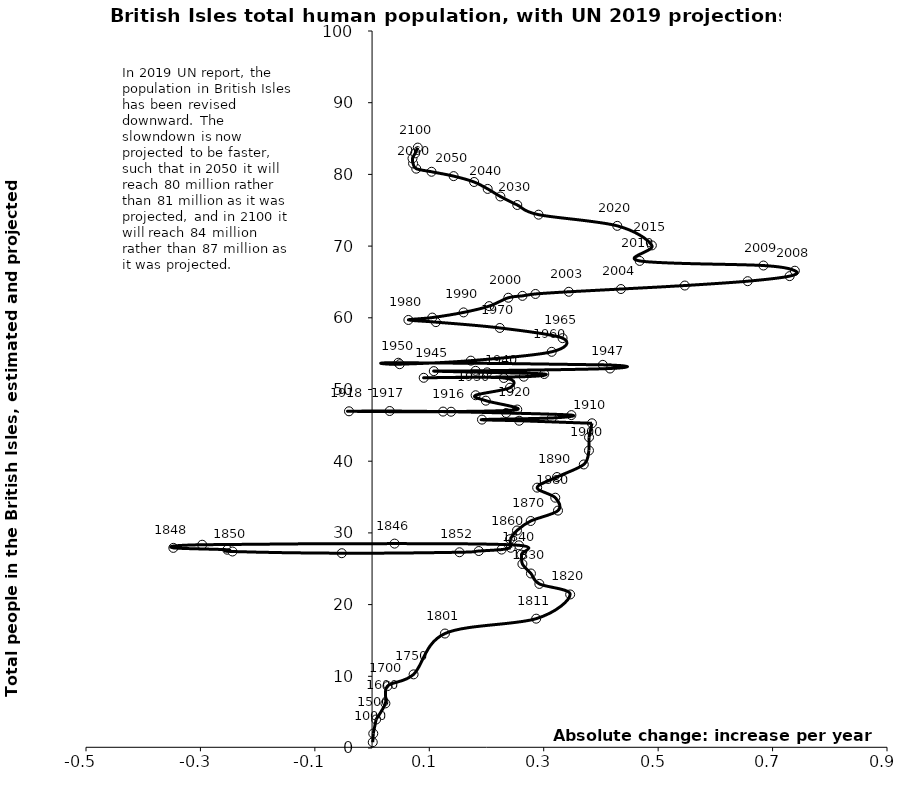
| Category | Series 0 |
|---|---|
| 0.0012099247809635326 | 0.807 |
| 0.0021133998564528684 | 2.017 |
| 0.007007481023080458 | 3.975 |
| 0.023306176093310045 | 6.221 |
| 0.026988186220119365 | 8.636 |
| 0.07256386630560646 | 10.269 |
| 0.12736464010998783 | 15.965 |
| 0.2868353542847504 | 18.039 |
| 0.3462304526245636 | 21.415 |
| 0.2923984887328537 | 22.886 |
| 0.27767773723113115 | 24.339 |
| 0.2627553315992472 | 25.663 |
| 0.2609404444278013 | 26.966 |
| 0.256604880629349 | 28.272 |
| 0.03932255538131457 | 28.506 |
| -0.2969357066614666 | 28.351 |
| -0.3473492392016144 | 27.912 |
| -0.25307593335153733 | 27.656 |
| -0.24400149749431144 | 27.406 |
| -0.05293420916715519 | 27.168 |
| 0.15275300359664712 | 27.3 |
| 0.18653007039854508 | 27.473 |
| 0.2263567611052597 | 27.673 |
| 0.24232104640964103 | 27.926 |
| 0.241178339672064 | 29.127 |
| 0.25327758748169915 | 30.338 |
| 0.27727442897080967 | 31.66 |
| 0.3249656307537883 | 33.111 |
| 0.320226758695015 | 34.909 |
| 0.2885670602598026 | 36.313 |
| 0.32325157064742316 | 37.795 |
| 0.3700353288446806 | 39.545 |
| 0.3791097647019079 | 41.495 |
| 0.3792105917669872 | 43.336 |
| 0.3843191630643877 | 45.287 |
| 0.2571090159547538 | 45.642 |
| 0.1920755589779617 | 45.802 |
| 0.31407630772511297 | 46.027 |
| 0.34835750985241987 | 46.43 |
| 0.23442292631168726 | 46.723 |
| 0.13813307915999928 | 46.899 |
| 0.030752254849488736 | 47 |
| -0.04033082603211824 | 46.96 |
| 0.12401729004876216 | 46.919 |
| 0.25374811378540824 | 47.208 |
| 0.1988309723383402 | 48.441 |
| 0.18098458181912846 | 49.197 |
| 0.24107751260698365 | 50.251 |
| 0.2302217986000059 | 51.607 |
| 0.09024022324686598 | 51.633 |
| 0.26517518116117245 | 51.788 |
| 0.3009687892646795 | 52.163 |
| 0.20114999483518758 | 52.39 |
| 0.10788495963591416 | 52.565 |
| 0.18098458181912846 | 52.606 |
| 0.4159116434562158 | 52.927 |
| 0.4033082603211753 | 53.437 |
| 0.04588538904739181 | 53.734 |
| 0.04828720112645376 | 53.529 |
| 0.17261600000000002 | 54.023 |
| 0.3139571000000011 | 55.255 |
| 0.3329665999999996 | 57.163 |
| 0.22330109999999975 | 58.585 |
| 0.11154950000000027 | 59.396 |
| 0.06350169999999977 | 59.7 |
| 0.10521599999999935 | 60.031 |
| 0.15987759999999937 | 60.753 |
| 0.20470359999999985 | 61.63 |
| 0.23812833333333336 | 62.8 |
| 0.262808500000002 | 63.059 |
| 0.2855665000000016 | 63.325 |
| 0.3438179999999953 | 63.63 |
| 0.43498099999999695 | 64.013 |
| 0.5466470000000072 | 64.5 |
| 0.6565010000000058 | 65.106 |
| 0.7298194999999978 | 65.813 |
| 0.7389689999999973 | 66.566 |
| 0.6839805000000112 | 67.291 |
| 0.467752666666667 | 67.934 |
| 0.48900259999999635 | 70.097 |
| 0.4285737000000026 | 72.824 |
| 0.29097339999999716 | 74.383 |
| 0.25379729999999795 | 75.734 |
| 0.2242447999999996 | 76.921 |
| 0.20206620000000158 | 77.976 |
| 0.17836170000000634 | 78.942 |
| 0.14253349999999756 | 79.76 |
| 0.10396049999999946 | 80.367 |
| 0.07720379999999996 | 80.799 |
| 0.07167044999999916 | 81.525 |
| 0.07062820000000088 | 82.233 |
| 0.07528064999999984 | 82.938 |
| 0.0799330999999988 | 83.738 |